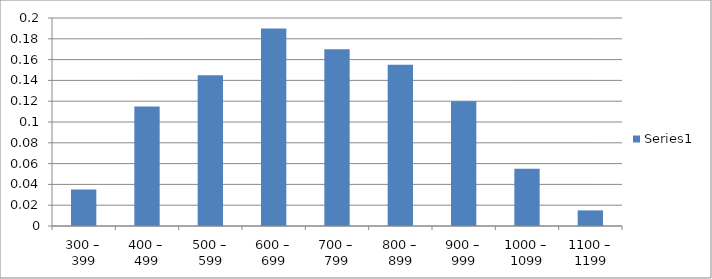
| Category | Series 0 |
|---|---|
| 300 – 399 | 0.035 |
| 400 – 499 | 0.115 |
| 500 – 599 | 0.145 |
| 600 – 699 | 0.19 |
| 700 – 799 | 0.17 |
| 800 – 899 | 0.155 |
| 900 – 999 | 0.12 |
| 1000 – 1099 | 0.055 |
| 1100 – 1199 | 0.015 |